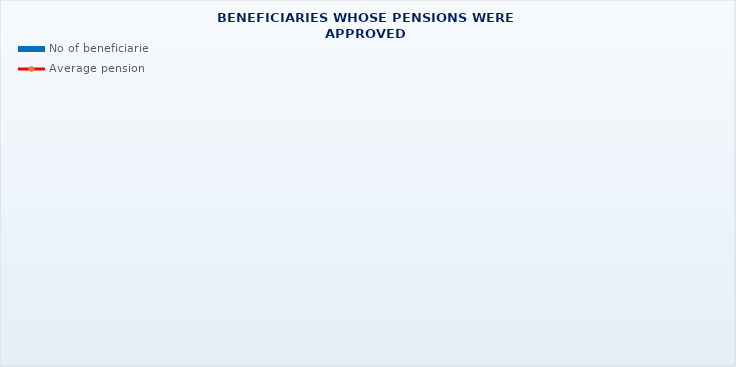
| Category | No of beneficiaries |
|---|---|
| Authorised officials in internal affairs, judicial officers and workers engaged in demining work: | 17264 |
| Active military personnel - DVO  | 15647 |
| Croatian Homeland Army veterans mobilised from 1941 to 1945 | 4133 |
| Former political prisoners | 2827 |
| Croatian Veterans from the Homeland War - ZOHBDR (Act on the Rights of Croatian Homeland War Veterans and their Family Members) | 71293 |
| Pensions approved under general regulations and determined according to the Act on the Rights of Croatian Homeland War Veterans and their Family Members (ZOHBDR), in 2017 (Art. 27, 35, 48 and 49, paragraph 2)    | 42560 |
| Former Yugoslav People's Army members - JNA   | 5459 |
| Former Yugoslav People's Army members - JNA - Art. 185 of Pension Insurance Act (ZOMO)  | 142 |
| National Liberation War veterans - NOR | 9798 |
| Members of the Croatian Parliament, members of the Government, judges of the Constitutional Court and the Auditor General | 674 |
| Members of the Parliamentary Executive Council and administratively retired federal civil servants  (relates to the former SFRY) | 95 |
| Former officials of federal bodies o the former SFRJ -  Article 38 of the Pension Insurance Act (ZOMO) | 34 |
| Full members of the Croatian Academy of Sciences and Arts - HAZU | 140 |
| Miners from the Istrian coal mines "Tupljak" d.d. Labin  | 254 |
| Workers professionally exposed to asbestos | 869 |
| Insurees - crew members on a ship in international and national navigation  - Article  129, paragraph 2 of the Maritime Code | 177 |
| Members of the Croatian Defence Council - HVO  | 6732 |